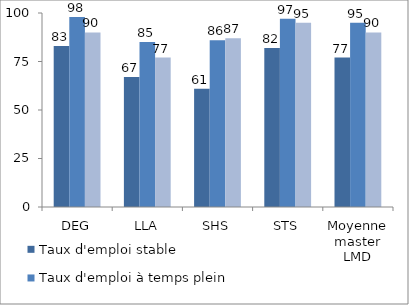
| Category | Taux d'emploi stable | Taux d'emploi à temps plein | Taux d'emploi de catégorie cadre ou professionns intermédiaires |
|---|---|---|---|
| DEG | 83 | 98 | 90 |
| LLA | 67 | 85 | 77 |
| SHS | 61 | 86 | 87 |
| STS | 82 | 97 | 95 |
| Moyenne master LMD | 77 | 95 | 90 |